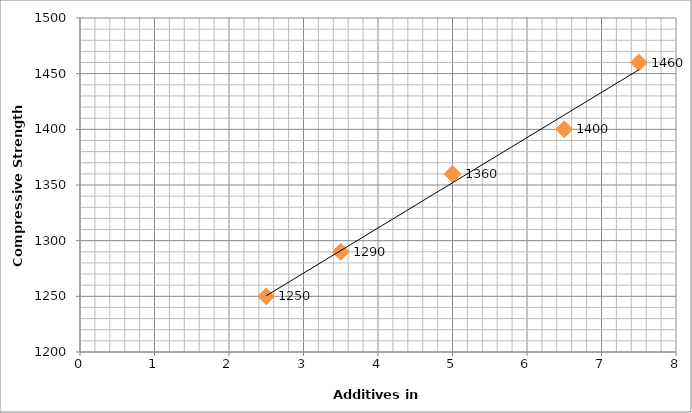
| Category | Compressive Strength (gm/cm²) |
|---|---|
| 2.5 | 1250 |
| 3.5 | 1290 |
| 5.0 | 1360 |
| 6.5 | 1400 |
| 7.5 | 1460 |